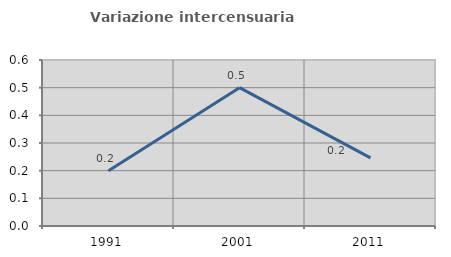
| Category | Variazione intercensuaria annua |
|---|---|
| 1991.0 | 0.2 |
| 2001.0 | 0.5 |
| 2011.0 | 0.246 |